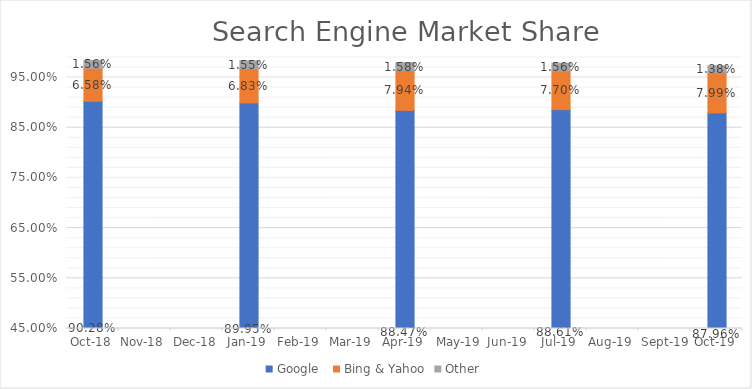
| Category | Google  | Bing & Yahoo | Other |
|---|---|---|---|
| 2018-10-01 | 0.903 | 0.066 | 0.016 |
| 2019-01-01 | 0.9 | 0.068 | 0.016 |
| 2019-04-01 | 0.885 | 0.079 | 0.016 |
| 2019-07-01 | 0.886 | 0.077 | 0.016 |
| 2019-10-01 | 0.88 | 0.08 | 0.014 |